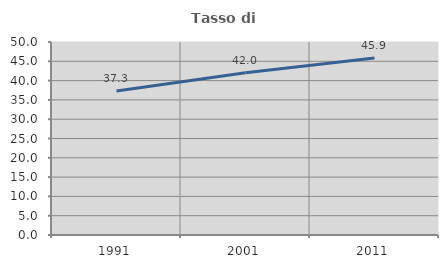
| Category | Tasso di occupazione   |
|---|---|
| 1991.0 | 37.329 |
| 2001.0 | 42.026 |
| 2011.0 | 45.856 |